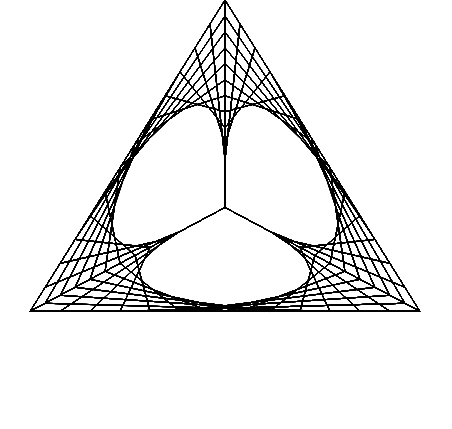
| Category | Series 0 |
|---|---|
| 6.1257422745431e-17 | 1 |
| 0.7327907262791404 | -0.269 |
| 0.26646935501059654 | -0.154 |
| 0.4663213712685439 | -0.269 |
| 0.19985201625794752 | -0.5 |
| -0.6661733875264911 | -0.385 |
| -0.06661733875264912 | -0.038 |
| -0.7994080650317894 | -0.462 |
| -0.19985201625794724 | 0.654 |
| 2.3560547209781152e-17 | 0.385 |
| 2.8272656651737385e-17 | 0.462 |
| 0.2664693550105966 | 0.538 |
| 0.7327907262791404 | -0.423 |
| 0.0 | 0 |
| 0.7327907262791404 | -0.423 |
| -0.3330866937632455 | -0.5 |
| -0.3997040325158947 | -0.231 |
| -0.33308669376324557 | -0.192 |
| -0.6661733875264911 | -0.154 |
| 5.654531330347477e-17 | 0.923 |
| 4.7121094419562276e-18 | 0.077 |
| 4.712109441956231e-17 | 0.769 |
| 0.5329387100211931 | 0.077 |
| 0.4663213712685439 | -0.269 |
| 0.26646935501059654 | -0.154 |
| 0.5995560487738422 | -0.5 |
| -0.8660254037844385 | -0.5 |
| -0.13323467750529824 | -0.077 |
| -0.599556048773842 | -0.346 |
| -0.39970403251589465 | 0.308 |
| 3.769687553564985e-17 | 0.615 |
| 1.4136328325868693e-17 | 0.231 |
| 0.06661733875264919 | 0.885 |
| 0.7994080650317896 | -0.385 |
| 0.19985201625794735 | -0.115 |
| 0.5329387100211931 | -0.308 |
| 0.06661733875264919 | -0.5 |
| -0.599556048773842 | -0.346 |
| -0.13323467750529824 | -0.077 |
| -0.8660254037844385 | -0.5 |
| -0.1332346775052982 | 0.769 |
| 1.8848437767824926e-17 | 0.308 |
| 3.2984766093693615e-17 | 0.538 |
| 0.33308669376324573 | 0.423 |
| 0.6661733875264912 | -0.385 |
| 0.06661733875264914 | -0.038 |
| 0.7994080650317896 | -0.462 |
| -0.4663213712685438 | -0.5 |
| -0.33308669376324557 | -0.192 |
| -0.3997040325158947 | -0.231 |
| -0.599556048773842 | -0.038 |
| 5.183320386151854e-17 | 0.846 |
| 0.0 | 0 |
| 5.183320386151854e-17 | 0.846 |
| 0.5995560487738422 | -0.038 |
| 0.3997040325158948 | -0.231 |
| 0.3330866937632457 | -0.192 |
| 0.4663213712685439 | -0.5 |
| -0.7994080650317894 | -0.462 |
| -0.06661733875264907 | -0.038 |
| -0.6661733875264911 | -0.385 |
| -0.3330866937632455 | 0.423 |
| 3.2984766093693615e-17 | 0.538 |
| 1.8848437767824926e-17 | 0.308 |
| 0.13323467750529833 | 0.769 |
| 0.8660254037844387 | -0.5 |
| 0.13323467750529827 | -0.077 |
| 0.5995560487738422 | -0.346 |
| -0.06661733875264897 | -0.5 |
| -0.532938710021193 | -0.308 |
| -0.19985201625794735 | -0.115 |
| -0.7994080650317894 | -0.385 |
| -0.06661733875264901 | 0.885 |
| 1.413632832586869e-17 | 0.231 |
| 3.769687553564985e-17 | 0.615 |
| 0.39970403251589487 | 0.308 |
| 0.5995560487738422 | -0.346 |
| 0.13323467750529827 | -0.077 |
| 0.8660254037844387 | -0.5 |
| -0.5995560487738419 | -0.5 |
| -0.2664693550105965 | -0.154 |
| -0.4663213712685438 | -0.269 |
| -0.532938710021193 | 0.077 |
| 4.7121094419562305e-17 | 0.769 |
| 4.7121094419562314e-18 | 0.077 |
| 5.654531330347477e-17 | 0.923 |
| 0.6661733875264914 | -0.154 |
| 0.3330866937632456 | -0.192 |
| 0.3997040325158948 | -0.231 |
| 0.3330866937632457 | -0.5 |
| -0.7327907262791402 | -0.423 |
| 0.0 | 0 |
| -0.7327907262791402 | -0.423 |
| -0.26646935501059643 | 0.538 |
| 2.8272656651737385e-17 | 0.462 |
| 2.3560547209781155e-17 | 0.385 |
| 0.19985201625794746 | 0.654 |
| 0.7994080650317896 | -0.462 |
| 0.06661733875264908 | -0.038 |
| 0.6661733875264914 | -0.385 |
| -0.19985201625794735 | -0.5 |
| -0.4663213712685438 | -0.269 |
| -0.2664693550105965 | -0.154 |
| -0.7327907262791402 | -0.269 |
| 6.1257422745431e-17 | 1 |
| 9.424218883912463e-18 | 0.154 |
| 4.2408984977606075e-17 | 0.692 |
| 0.46632137126854395 | 0.192 |
| 0.5329387100211931 | -0.308 |
| 0.1998520162579474 | -0.115 |
| 0.7327907262791405 | -0.5 |
| -0.7327907262791403 | -0.5 |
| -0.1998520162579473 | -0.115 |
| -0.532938710021193 | -0.308 |
| -0.4663213712685437 | 0.192 |
| 4.2408984977606075e-17 | 0.692 |
| 9.424218883912463e-18 | 0.154 |
| 6.1257422745431e-17 | 1 |
| 0.7327907262791404 | -0.269 |
| 0.26646935501059654 | -0.154 |
| 0.4663213712685439 | -0.269 |
| 0.19985201625794752 | -0.5 |
| -0.6661733875264911 | -0.385 |
| -0.06661733875264912 | -0.038 |
| -0.7994080650317894 | -0.462 |
| -0.19985201625794724 | 0.654 |
| 2.3560547209781152e-17 | 0.385 |
| 2.8272656651737385e-17 | 0.462 |
| 0.2664693550105966 | 0.538 |
| 0.7327907262791404 | -0.423 |
| 0.0 | 0 |
| 0.7327907262791404 | -0.423 |
| -0.3330866937632455 | -0.5 |
| -0.3997040325158947 | -0.231 |
| -0.33308669376324557 | -0.192 |
| -0.6661733875264911 | -0.154 |
| 5.654531330347477e-17 | 0.923 |
| 4.7121094419562276e-18 | 0.077 |
| 4.712109441956231e-17 | 0.769 |
| 0.5329387100211931 | 0.077 |
| 0.4663213712685439 | -0.269 |
| 0.26646935501059654 | -0.154 |
| 0.5995560487738422 | -0.5 |
| -0.8660254037844385 | -0.5 |
| -0.13323467750529824 | -0.077 |
| -0.599556048773842 | -0.346 |
| -0.39970403251589465 | 0.308 |
| 3.769687553564985e-17 | 0.615 |
| 1.4136328325868693e-17 | 0.231 |
| 0.06661733875264919 | 0.885 |
| 0.7994080650317896 | -0.385 |
| 0.19985201625794735 | -0.115 |
| 0.5329387100211931 | -0.308 |
| 0.06661733875264919 | -0.5 |
| -0.599556048773842 | -0.346 |
| -0.13323467750529824 | -0.077 |
| -0.8660254037844385 | -0.5 |
| -0.1332346775052982 | 0.769 |
| 1.8848437767824926e-17 | 0.308 |
| 3.2984766093693615e-17 | 0.538 |
| 0.33308669376324573 | 0.423 |
| 0.6661733875264912 | -0.385 |
| 0.06661733875264914 | -0.038 |
| 0.7994080650317896 | -0.462 |
| -0.4663213712685438 | -0.5 |
| -0.33308669376324557 | -0.192 |
| -0.3997040325158947 | -0.231 |
| -0.599556048773842 | -0.038 |
| 5.183320386151854e-17 | 0.846 |
| 0.0 | 0 |
| 5.183320386151854e-17 | 0.846 |
| 0.5995560487738422 | -0.038 |
| 0.3997040325158948 | -0.231 |
| 0.3330866937632457 | -0.192 |
| 0.4663213712685439 | -0.5 |
| -0.7994080650317894 | -0.462 |
| -0.06661733875264907 | -0.038 |
| -0.6661733875264911 | -0.385 |
| -0.3330866937632455 | 0.423 |
| 3.2984766093693615e-17 | 0.538 |
| 1.8848437767824926e-17 | 0.308 |
| 0.13323467750529833 | 0.769 |
| 0.8660254037844387 | -0.5 |
| 0.13323467750529827 | -0.077 |
| 0.5995560487738422 | -0.346 |
| -0.06661733875264897 | -0.5 |
| -0.532938710021193 | -0.308 |
| -0.19985201625794735 | -0.115 |
| -0.7994080650317894 | -0.385 |
| -0.06661733875264901 | 0.885 |
| 1.413632832586869e-17 | 0.231 |
| 3.769687553564985e-17 | 0.615 |
| 0.39970403251589487 | 0.308 |
| 0.5995560487738422 | -0.346 |
| 0.13323467750529827 | -0.077 |
| 0.8660254037844387 | -0.5 |
| -0.5995560487738419 | -0.5 |
| -0.2664693550105965 | -0.154 |
| -0.4663213712685438 | -0.269 |
| -0.532938710021193 | 0.077 |
| 4.7121094419562305e-17 | 0.769 |
| 4.7121094419562314e-18 | 0.077 |
| 5.654531330347477e-17 | 0.923 |
| 0.6661733875264914 | -0.154 |
| 0.3330866937632456 | -0.192 |
| 0.3997040325158948 | -0.231 |
| 0.3330866937632457 | -0.5 |
| -0.7327907262791402 | -0.423 |
| 0.0 | 0 |
| -0.7327907262791402 | -0.423 |
| -0.26646935501059643 | 0.538 |
| 2.8272656651737385e-17 | 0.462 |
| 2.3560547209781155e-17 | 0.385 |
| 0.19985201625794746 | 0.654 |
| 0.7994080650317896 | -0.462 |
| 0.06661733875264908 | -0.038 |
| 0.6661733875264914 | -0.385 |
| -0.19985201625794735 | -0.5 |
| -0.4663213712685438 | -0.269 |
| -0.2664693550105965 | -0.154 |
| -0.7327907262791402 | -0.269 |
| 6.1257422745431e-17 | 1 |
| 9.424218883912463e-18 | 0.154 |
| 4.2408984977606075e-17 | 0.692 |
| 0.46632137126854395 | 0.192 |
| 0.5329387100211931 | -0.308 |
| 0.1998520162579474 | -0.115 |
| 0.7327907262791405 | -0.5 |
| -0.7327907262791403 | -0.5 |
| -0.1998520162579473 | -0.115 |
| -0.532938710021193 | -0.308 |
| -0.4663213712685437 | 0.192 |
| 4.2408984977606075e-17 | 0.692 |
| 9.424218883912463e-18 | 0.154 |
| 6.1257422745431e-17 | 1 |
| 0.7327907262791404 | -0.269 |
| 0.26646935501059654 | -0.154 |
| 0.4663213712685439 | -0.269 |
| 0.19985201625794752 | -0.5 |
| -0.6661733875264911 | -0.385 |
| -0.06661733875264912 | -0.038 |
| -0.7994080650317894 | -0.462 |
| -0.19985201625794724 | 0.654 |
| 2.3560547209781152e-17 | 0.385 |
| 2.8272656651737385e-17 | 0.462 |
| 0.2664693550105966 | 0.538 |
| 0.7327907262791404 | -0.423 |
| 0.0 | 0 |
| 0.7327907262791404 | -0.423 |
| -0.3330866937632455 | -0.5 |
| -0.3997040325158947 | -0.231 |
| -0.33308669376324557 | -0.192 |
| -0.6661733875264911 | -0.154 |
| 5.654531330347477e-17 | 0.923 |
| 4.7121094419562276e-18 | 0.077 |
| 4.712109441956231e-17 | 0.769 |
| 0.5329387100211931 | 0.077 |
| 0.4663213712685439 | -0.269 |
| 0.26646935501059654 | -0.154 |
| 0.5995560487738422 | -0.5 |
| -0.8660254037844385 | -0.5 |
| -0.13323467750529824 | -0.077 |
| -0.599556048773842 | -0.346 |
| -0.39970403251589465 | 0.308 |
| 3.769687553564985e-17 | 0.615 |
| 1.4136328325868693e-17 | 0.231 |
| 0.06661733875264919 | 0.885 |
| 0.7994080650317896 | -0.385 |
| 0.19985201625794735 | -0.115 |
| 0.5329387100211931 | -0.308 |
| 0.06661733875264919 | -0.5 |
| -0.599556048773842 | -0.346 |
| -0.13323467750529824 | -0.077 |
| -0.8660254037844385 | -0.5 |
| -0.1332346775052982 | 0.769 |
| 1.8848437767824926e-17 | 0.308 |
| 3.2984766093693615e-17 | 0.538 |
| 0.33308669376324573 | 0.423 |
| 0.6661733875264912 | -0.385 |
| 0.06661733875264914 | -0.038 |
| 0.7994080650317896 | -0.462 |
| -0.4663213712685438 | -0.5 |
| -0.33308669376324557 | -0.192 |
| -0.3997040325158947 | -0.231 |
| -0.599556048773842 | -0.038 |
| 5.183320386151854e-17 | 0.846 |
| 0.0 | 0 |
| 5.183320386151854e-17 | 0.846 |
| 0.5995560487738422 | -0.038 |
| 0.3997040325158948 | -0.231 |
| 0.3330866937632457 | -0.192 |
| 0.4663213712685439 | -0.5 |
| -0.7994080650317894 | -0.462 |
| -0.06661733875264907 | -0.038 |
| -0.6661733875264911 | -0.385 |
| -0.3330866937632455 | 0.423 |
| 3.2984766093693615e-17 | 0.538 |
| 1.8848437767824926e-17 | 0.308 |
| 0.13323467750529833 | 0.769 |
| 0.8660254037844387 | -0.5 |
| 0.13323467750529827 | -0.077 |
| 0.5995560487738422 | -0.346 |
| -0.06661733875264897 | -0.5 |
| -0.532938710021193 | -0.308 |
| -0.19985201625794735 | -0.115 |
| -0.7994080650317894 | -0.385 |
| -0.06661733875264901 | 0.885 |
| 1.413632832586869e-17 | 0.231 |
| 3.769687553564985e-17 | 0.615 |
| 0.39970403251589487 | 0.308 |
| 0.5995560487738422 | -0.346 |
| 0.13323467750529827 | -0.077 |
| 0.8660254037844387 | -0.5 |
| -0.5995560487738419 | -0.5 |
| -0.2664693550105965 | -0.154 |
| -0.4663213712685438 | -0.269 |
| -0.532938710021193 | 0.077 |
| 4.7121094419562305e-17 | 0.769 |
| 4.7121094419562314e-18 | 0.077 |
| 5.654531330347477e-17 | 0.923 |
| 0.6661733875264914 | -0.154 |
| 0.3330866937632456 | -0.192 |
| 0.3997040325158948 | -0.231 |
| 0.3330866937632457 | -0.5 |
| -0.7327907262791402 | -0.423 |
| 0.0 | 0 |
| -0.7327907262791402 | -0.423 |
| -0.26646935501059643 | 0.538 |
| 2.8272656651737385e-17 | 0.462 |
| 2.3560547209781155e-17 | 0.385 |
| 0.19985201625794746 | 0.654 |
| 0.7994080650317896 | -0.462 |
| 0.06661733875264908 | -0.038 |
| 0.6661733875264914 | -0.385 |
| -0.19985201625794735 | -0.5 |
| -0.4663213712685438 | -0.269 |
| -0.2664693550105965 | -0.154 |
| -0.7327907262791402 | -0.269 |
| 6.1257422745431e-17 | 1 |
| 9.424218883912463e-18 | 0.154 |
| 4.2408984977606075e-17 | 0.692 |
| 0.46632137126854395 | 0.192 |
| 0.5329387100211931 | -0.308 |
| 0.1998520162579474 | -0.115 |
| 0.7327907262791405 | -0.5 |
| -0.7327907262791403 | -0.5 |
| -0.1998520162579473 | -0.115 |
| -0.532938710021193 | -0.308 |
| -0.4663213712685437 | 0.192 |
| 4.2408984977606075e-17 | 0.692 |
| 9.424218883912463e-18 | 0.154 |
| 6.1257422745431e-17 | 1 |
| 0.7327907262791404 | -0.269 |
| 0.26646935501059654 | -0.154 |
| 0.4663213712685439 | -0.269 |
| 0.19985201625794752 | -0.5 |
| -0.6661733875264911 | -0.385 |
| -0.06661733875264912 | -0.038 |
| -0.7994080650317894 | -0.462 |
| -0.19985201625794724 | 0.654 |
| 2.3560547209781152e-17 | 0.385 |
| 2.8272656651737385e-17 | 0.462 |
| 0.2664693550105966 | 0.538 |
| 0.7327907262791404 | -0.423 |
| 0.0 | 0 |
| 0.7327907262791404 | -0.423 |
| -0.3330866937632455 | -0.5 |
| -0.3997040325158947 | -0.231 |
| -0.33308669376324557 | -0.192 |
| -0.6661733875264911 | -0.154 |
| 5.654531330347477e-17 | 0.923 |
| 4.7121094419562276e-18 | 0.077 |
| 4.712109441956231e-17 | 0.769 |
| 0.5329387100211931 | 0.077 |
| 0.4663213712685439 | -0.269 |
| 0.26646935501059654 | -0.154 |
| 0.5995560487738422 | -0.5 |
| -0.8660254037844385 | -0.5 |
| -0.13323467750529824 | -0.077 |
| -0.599556048773842 | -0.346 |
| -0.39970403251589465 | 0.308 |
| 3.769687553564985e-17 | 0.615 |
| 1.4136328325868693e-17 | 0.231 |
| 0.06661733875264919 | 0.885 |
| 0.7994080650317896 | -0.385 |
| 0.19985201625794735 | -0.115 |
| 0.5329387100211931 | -0.308 |
| 0.06661733875264919 | -0.5 |
| -0.599556048773842 | -0.346 |
| -0.13323467750529824 | -0.077 |
| -0.8660254037844385 | -0.5 |
| -0.1332346775052982 | 0.769 |
| 1.8848437767824926e-17 | 0.308 |
| 3.2984766093693615e-17 | 0.538 |
| 0.33308669376324573 | 0.423 |
| 0.6661733875264912 | -0.385 |
| 0.06661733875264914 | -0.038 |
| 0.7994080650317896 | -0.462 |
| -0.4663213712685438 | -0.5 |
| -0.33308669376324557 | -0.192 |
| -0.3997040325158947 | -0.231 |
| -0.599556048773842 | -0.038 |
| 5.183320386151854e-17 | 0.846 |
| 0.0 | 0 |
| 5.183320386151854e-17 | 0.846 |
| 0.5995560487738422 | -0.038 |
| 0.3997040325158948 | -0.231 |
| 0.3330866937632457 | -0.192 |
| 0.4663213712685439 | -0.5 |
| -0.7994080650317894 | -0.462 |
| -0.06661733875264907 | -0.038 |
| -0.6661733875264911 | -0.385 |
| -0.3330866937632455 | 0.423 |
| 3.2984766093693615e-17 | 0.538 |
| 1.8848437767824926e-17 | 0.308 |
| 0.13323467750529833 | 0.769 |
| 0.8660254037844387 | -0.5 |
| 0.13323467750529827 | -0.077 |
| 0.5995560487738422 | -0.346 |
| -0.06661733875264897 | -0.5 |
| -0.532938710021193 | -0.308 |
| -0.19985201625794735 | -0.115 |
| -0.7994080650317894 | -0.385 |
| -0.06661733875264901 | 0.885 |
| 1.413632832586869e-17 | 0.231 |
| 3.769687553564985e-17 | 0.615 |
| 0.39970403251589487 | 0.308 |
| 0.5995560487738422 | -0.346 |
| 0.13323467750529827 | -0.077 |
| 0.8660254037844387 | -0.5 |
| -0.5995560487738419 | -0.5 |
| -0.2664693550105965 | -0.154 |
| -0.4663213712685438 | -0.269 |
| -0.532938710021193 | 0.077 |
| 4.7121094419562305e-17 | 0.769 |
| 4.7121094419562314e-18 | 0.077 |
| 5.654531330347477e-17 | 0.923 |
| 0.6661733875264914 | -0.154 |
| 0.3330866937632456 | -0.192 |
| 0.3997040325158948 | -0.231 |
| 0.3330866937632457 | -0.5 |
| -0.7327907262791402 | -0.423 |
| 0.0 | 0 |
| -0.7327907262791402 | -0.423 |
| -0.26646935501059643 | 0.538 |
| 2.8272656651737385e-17 | 0.462 |
| 2.3560547209781155e-17 | 0.385 |
| 0.19985201625794746 | 0.654 |
| 0.7994080650317896 | -0.462 |
| 0.06661733875264908 | -0.038 |
| 0.6661733875264914 | -0.385 |
| -0.19985201625794735 | -0.5 |
| -0.4663213712685438 | -0.269 |
| -0.2664693550105965 | -0.154 |
| -0.7327907262791402 | -0.269 |
| 6.1257422745431e-17 | 1 |
| 9.424218883912463e-18 | 0.154 |
| 4.2408984977606075e-17 | 0.692 |
| 0.46632137126854395 | 0.192 |
| 0.5329387100211931 | -0.308 |
| 0.1998520162579474 | -0.115 |
| 0.7327907262791405 | -0.5 |
| -0.7327907262791403 | -0.5 |
| -0.1998520162579473 | -0.115 |
| -0.532938710021193 | -0.308 |
| -0.4663213712685437 | 0.192 |
| 4.2408984977606075e-17 | 0.692 |
| 9.424218883912463e-18 | 0.154 |
| 6.1257422745431e-17 | 1 |
| 0.7327907262791404 | -0.269 |
| 0.26646935501059654 | -0.154 |
| 0.4663213712685439 | -0.269 |
| 0.19985201625794752 | -0.5 |
| -0.6661733875264911 | -0.385 |
| -0.06661733875264912 | -0.038 |
| -0.7994080650317894 | -0.462 |
| -0.19985201625794724 | 0.654 |
| 2.3560547209781152e-17 | 0.385 |
| 2.8272656651737385e-17 | 0.462 |
| 0.2664693550105966 | 0.538 |
| 0.7327907262791404 | -0.423 |
| 0.0 | 0 |
| 0.7327907262791404 | -0.423 |
| -0.3330866937632455 | -0.5 |
| -0.3997040325158947 | -0.231 |
| -0.33308669376324557 | -0.192 |
| -0.6661733875264911 | -0.154 |
| 5.654531330347477e-17 | 0.923 |
| 4.7121094419562276e-18 | 0.077 |
| 4.712109441956231e-17 | 0.769 |
| 0.5329387100211931 | 0.077 |
| 0.4663213712685439 | -0.269 |
| 0.26646935501059654 | -0.154 |
| 0.5995560487738422 | -0.5 |
| -0.8660254037844385 | -0.5 |
| -0.13323467750529824 | -0.077 |
| -0.599556048773842 | -0.346 |
| -0.39970403251589465 | 0.308 |
| 3.769687553564985e-17 | 0.615 |
| 1.4136328325868693e-17 | 0.231 |
| 0.06661733875264919 | 0.885 |
| 0.7994080650317896 | -0.385 |
| 0.19985201625794735 | -0.115 |
| 0.5329387100211931 | -0.308 |
| 0.06661733875264919 | -0.5 |
| -0.599556048773842 | -0.346 |
| -0.13323467750529824 | -0.077 |
| -0.8660254037844385 | -0.5 |
| -0.1332346775052982 | 0.769 |
| 1.8848437767824926e-17 | 0.308 |
| 3.2984766093693615e-17 | 0.538 |
| 0.33308669376324573 | 0.423 |
| 0.6661733875264912 | -0.385 |
| 0.06661733875264914 | -0.038 |
| 0.7994080650317896 | -0.462 |
| -0.4663213712685438 | -0.5 |
| -0.33308669376324557 | -0.192 |
| -0.3997040325158947 | -0.231 |
| -0.599556048773842 | -0.038 |
| 5.183320386151854e-17 | 0.846 |
| 0.0 | 0 |
| 5.183320386151854e-17 | 0.846 |
| 0.5995560487738422 | -0.038 |
| 0.3997040325158948 | -0.231 |
| 0.3330866937632457 | -0.192 |
| 0.4663213712685439 | -0.5 |
| -0.7994080650317894 | -0.462 |
| -0.06661733875264907 | -0.038 |
| -0.6661733875264911 | -0.385 |
| -0.3330866937632455 | 0.423 |
| 3.2984766093693615e-17 | 0.538 |
| 1.8848437767824926e-17 | 0.308 |
| 0.13323467750529833 | 0.769 |
| 0.8660254037844387 | -0.5 |
| 0.13323467750529827 | -0.077 |
| 0.5995560487738422 | -0.346 |
| -0.06661733875264897 | -0.5 |
| -0.532938710021193 | -0.308 |
| -0.19985201625794735 | -0.115 |
| -0.7994080650317894 | -0.385 |
| -0.06661733875264901 | 0.885 |
| 1.413632832586869e-17 | 0.231 |
| 3.769687553564985e-17 | 0.615 |
| 0.39970403251589487 | 0.308 |
| 0.5995560487738422 | -0.346 |
| 0.13323467750529827 | -0.077 |
| 0.8660254037844387 | -0.5 |
| -0.5995560487738419 | -0.5 |
| -0.2664693550105965 | -0.154 |
| -0.4663213712685438 | -0.269 |
| -0.532938710021193 | 0.077 |
| 4.7121094419562305e-17 | 0.769 |
| 4.7121094419562314e-18 | 0.077 |
| 5.654531330347477e-17 | 0.923 |
| 0.6661733875264914 | -0.154 |
| 0.3330866937632456 | -0.192 |
| 0.3997040325158948 | -0.231 |
| 0.3330866937632457 | -0.5 |
| -0.7327907262791402 | -0.423 |
| 0.0 | 0 |
| -0.7327907262791402 | -0.423 |
| -0.26646935501059643 | 0.538 |
| 2.8272656651737385e-17 | 0.462 |
| 2.3560547209781155e-17 | 0.385 |
| 0.19985201625794746 | 0.654 |
| 0.7994080650317896 | -0.462 |
| 0.06661733875264908 | -0.038 |
| 0.6661733875264914 | -0.385 |
| -0.19985201625794735 | -0.5 |
| -0.4663213712685438 | -0.269 |
| -0.2664693550105965 | -0.154 |
| -0.7327907262791402 | -0.269 |
| 6.1257422745431e-17 | 1 |
| 9.424218883912463e-18 | 0.154 |
| 4.2408984977606075e-17 | 0.692 |
| 0.46632137126854395 | 0.192 |
| 0.5329387100211931 | -0.308 |
| 0.1998520162579474 | -0.115 |
| 0.7327907262791405 | -0.5 |
| -0.7327907262791403 | -0.5 |
| -0.1998520162579473 | -0.115 |
| -0.532938710021193 | -0.308 |
| -0.4663213712685437 | 0.192 |
| 4.2408984977606075e-17 | 0.692 |
| 9.424218883912463e-18 | 0.154 |
| 6.1257422745431e-17 | 1 |
| 0.7327907262791404 | -0.269 |
| 0.26646935501059654 | -0.154 |
| 0.4663213712685439 | -0.269 |
| 0.19985201625794752 | -0.5 |
| -0.6661733875264911 | -0.385 |
| -0.06661733875264912 | -0.038 |
| -0.7994080650317894 | -0.462 |
| -0.19985201625794724 | 0.654 |
| 2.3560547209781152e-17 | 0.385 |
| 2.8272656651737385e-17 | 0.462 |
| 0.2664693550105966 | 0.538 |
| 0.7327907262791404 | -0.423 |
| 0.0 | 0 |
| 0.7327907262791404 | -0.423 |
| -0.3330866937632455 | -0.5 |
| -0.3997040325158947 | -0.231 |
| -0.33308669376324557 | -0.192 |
| -0.6661733875264911 | -0.154 |
| 5.654531330347477e-17 | 0.923 |
| 4.7121094419562276e-18 | 0.077 |
| 4.712109441956231e-17 | 0.769 |
| 0.5329387100211931 | 0.077 |
| 0.4663213712685439 | -0.269 |
| 0.26646935501059654 | -0.154 |
| 0.5995560487738422 | -0.5 |
| -0.8660254037844385 | -0.5 |
| -0.13323467750529824 | -0.077 |
| -0.599556048773842 | -0.346 |
| -0.39970403251589465 | 0.308 |
| 3.769687553564985e-17 | 0.615 |
| 1.4136328325868693e-17 | 0.231 |
| 0.06661733875264919 | 0.885 |
| 0.7994080650317896 | -0.385 |
| 0.19985201625794735 | -0.115 |
| 0.5329387100211931 | -0.308 |
| 0.06661733875264919 | -0.5 |
| -0.599556048773842 | -0.346 |
| -0.13323467750529824 | -0.077 |
| -0.8660254037844385 | -0.5 |
| -0.1332346775052982 | 0.769 |
| 1.8848437767824926e-17 | 0.308 |
| 3.2984766093693615e-17 | 0.538 |
| 0.33308669376324573 | 0.423 |
| 0.6661733875264912 | -0.385 |
| 0.06661733875264914 | -0.038 |
| 0.7994080650317896 | -0.462 |
| -0.4663213712685438 | -0.5 |
| -0.33308669376324557 | -0.192 |
| -0.3997040325158947 | -0.231 |
| -0.599556048773842 | -0.038 |
| 5.183320386151854e-17 | 0.846 |
| 0.0 | 0 |
| 5.183320386151854e-17 | 0.846 |
| 0.5995560487738422 | -0.038 |
| 0.3997040325158948 | -0.231 |
| 0.3330866937632457 | -0.192 |
| 0.4663213712685439 | -0.5 |
| -0.7994080650317894 | -0.462 |
| -0.06661733875264907 | -0.038 |
| -0.6661733875264911 | -0.385 |
| -0.3330866937632455 | 0.423 |
| 3.2984766093693615e-17 | 0.538 |
| 1.8848437767824926e-17 | 0.308 |
| 0.13323467750529833 | 0.769 |
| 0.8660254037844387 | -0.5 |
| 0.13323467750529827 | -0.077 |
| 0.5995560487738422 | -0.346 |
| -0.06661733875264897 | -0.5 |
| -0.532938710021193 | -0.308 |
| -0.19985201625794735 | -0.115 |
| -0.7994080650317894 | -0.385 |
| -0.06661733875264901 | 0.885 |
| 1.413632832586869e-17 | 0.231 |
| 3.769687553564985e-17 | 0.615 |
| 0.39970403251589487 | 0.308 |
| 0.5995560487738422 | -0.346 |
| 0.13323467750529827 | -0.077 |
| 0.8660254037844387 | -0.5 |
| -0.5995560487738419 | -0.5 |
| -0.2664693550105965 | -0.154 |
| -0.4663213712685438 | -0.269 |
| -0.532938710021193 | 0.077 |
| 4.7121094419562305e-17 | 0.769 |
| 4.7121094419562314e-18 | 0.077 |
| 5.654531330347477e-17 | 0.923 |
| 0.6661733875264914 | -0.154 |
| 0.3330866937632456 | -0.192 |
| 0.3997040325158948 | -0.231 |
| 0.3330866937632457 | -0.5 |
| -0.7327907262791402 | -0.423 |
| 0.0 | 0 |
| -0.7327907262791402 | -0.423 |
| -0.26646935501059643 | 0.538 |
| 2.8272656651737385e-17 | 0.462 |
| 2.3560547209781155e-17 | 0.385 |
| 0.19985201625794746 | 0.654 |
| 0.7994080650317896 | -0.462 |
| 0.06661733875264908 | -0.038 |
| 0.6661733875264914 | -0.385 |
| -0.19985201625794735 | -0.5 |
| -0.4663213712685438 | -0.269 |
| -0.2664693550105965 | -0.154 |
| -0.7327907262791402 | -0.269 |
| 6.1257422745431e-17 | 1 |
| 9.424218883912463e-18 | 0.154 |
| 4.2408984977606075e-17 | 0.692 |
| 0.46632137126854395 | 0.192 |
| 0.5329387100211931 | -0.308 |
| 0.1998520162579474 | -0.115 |
| 0.7327907262791405 | -0.5 |
| -0.7327907262791403 | -0.5 |
| -0.1998520162579473 | -0.115 |
| -0.532938710021193 | -0.308 |
| -0.4663213712685437 | 0.192 |
| 4.2408984977606075e-17 | 0.692 |
| 9.424218883912463e-18 | 0.154 |
| 6.1257422745431e-17 | 1 |
| 0.7327907262791404 | -0.269 |
| 0.26646935501059654 | -0.154 |
| 0.4663213712685439 | -0.269 |
| 0.19985201625794752 | -0.5 |
| -0.6661733875264911 | -0.385 |
| -0.06661733875264912 | -0.038 |
| -0.7994080650317894 | -0.462 |
| -0.19985201625794724 | 0.654 |
| 2.3560547209781152e-17 | 0.385 |
| 2.8272656651737385e-17 | 0.462 |
| 0.2664693550105966 | 0.538 |
| 0.7327907262791404 | -0.423 |
| 0.0 | 0 |
| 0.7327907262791404 | -0.423 |
| -0.3330866937632455 | -0.5 |
| -0.3997040325158947 | -0.231 |
| -0.33308669376324557 | -0.192 |
| -0.6661733875264911 | -0.154 |
| 5.654531330347477e-17 | 0.923 |
| 4.7121094419562276e-18 | 0.077 |
| 4.712109441956231e-17 | 0.769 |
| 0.5329387100211931 | 0.077 |
| 0.4663213712685439 | -0.269 |
| 0.26646935501059654 | -0.154 |
| 0.5995560487738422 | -0.5 |
| -0.8660254037844385 | -0.5 |
| -0.13323467750529824 | -0.077 |
| -0.599556048773842 | -0.346 |
| -0.39970403251589465 | 0.308 |
| 3.769687553564985e-17 | 0.615 |
| 1.4136328325868693e-17 | 0.231 |
| 0.06661733875264919 | 0.885 |
| 0.7994080650317896 | -0.385 |
| 0.19985201625794735 | -0.115 |
| 0.5329387100211931 | -0.308 |
| 0.06661733875264919 | -0.5 |
| -0.599556048773842 | -0.346 |
| -0.13323467750529824 | -0.077 |
| -0.8660254037844385 | -0.5 |
| -0.1332346775052982 | 0.769 |
| 1.8848437767824926e-17 | 0.308 |
| 3.2984766093693615e-17 | 0.538 |
| 0.33308669376324573 | 0.423 |
| 0.6661733875264912 | -0.385 |
| 0.06661733875264914 | -0.038 |
| 0.7994080650317896 | -0.462 |
| -0.4663213712685438 | -0.5 |
| -0.33308669376324557 | -0.192 |
| -0.3997040325158947 | -0.231 |
| -0.599556048773842 | -0.038 |
| 5.183320386151854e-17 | 0.846 |
| 0.0 | 0 |
| 5.183320386151854e-17 | 0.846 |
| 0.5995560487738422 | -0.038 |
| 0.3997040325158948 | -0.231 |
| 0.3330866937632457 | -0.192 |
| 0.4663213712685439 | -0.5 |
| -0.7994080650317894 | -0.462 |
| -0.06661733875264907 | -0.038 |
| -0.6661733875264911 | -0.385 |
| -0.3330866937632455 | 0.423 |
| 3.2984766093693615e-17 | 0.538 |
| 1.8848437767824926e-17 | 0.308 |
| 0.13323467750529833 | 0.769 |
| 0.8660254037844387 | -0.5 |
| 0.13323467750529827 | -0.077 |
| 0.5995560487738422 | -0.346 |
| -0.06661733875264897 | -0.5 |
| -0.532938710021193 | -0.308 |
| -0.19985201625794735 | -0.115 |
| -0.7994080650317894 | -0.385 |
| -0.06661733875264901 | 0.885 |
| 1.413632832586869e-17 | 0.231 |
| 3.769687553564985e-17 | 0.615 |
| 0.39970403251589487 | 0.308 |
| 0.5995560487738422 | -0.346 |
| 0.13323467750529827 | -0.077 |
| 0.8660254037844387 | -0.5 |
| -0.5995560487738419 | -0.5 |
| -0.2664693550105965 | -0.154 |
| -0.4663213712685438 | -0.269 |
| -0.532938710021193 | 0.077 |
| 4.7121094419562305e-17 | 0.769 |
| 4.7121094419562314e-18 | 0.077 |
| 5.654531330347477e-17 | 0.923 |
| 0.6661733875264914 | -0.154 |
| 0.3330866937632456 | -0.192 |
| 0.3997040325158948 | -0.231 |
| 0.3330866937632457 | -0.5 |
| -0.7327907262791402 | -0.423 |
| 0.0 | 0 |
| -0.7327907262791402 | -0.423 |
| -0.26646935501059643 | 0.538 |
| 2.8272656651737385e-17 | 0.462 |
| 2.3560547209781155e-17 | 0.385 |
| 0.19985201625794746 | 0.654 |
| 0.7994080650317896 | -0.462 |
| 0.06661733875264908 | -0.038 |
| 0.6661733875264914 | -0.385 |
| -0.19985201625794735 | -0.5 |
| -0.4663213712685438 | -0.269 |
| -0.2664693550105965 | -0.154 |
| -0.7327907262791402 | -0.269 |
| 6.1257422745431e-17 | 1 |
| 9.424218883912463e-18 | 0.154 |
| 4.2408984977606075e-17 | 0.692 |
| 0.46632137126854395 | 0.192 |
| 0.5329387100211931 | -0.308 |
| 0.1998520162579474 | -0.115 |
| 0.7327907262791405 | -0.5 |
| -0.7327907262791403 | -0.5 |
| -0.1998520162579473 | -0.115 |
| -0.532938710021193 | -0.308 |
| -0.4663213712685437 | 0.192 |
| 4.2408984977606075e-17 | 0.692 |
| 9.424218883912463e-18 | 0.154 |
| 6.1257422745431e-17 | 1 |
| 0.7327907262791404 | -0.269 |
| 0.26646935501059654 | -0.154 |
| 0.4663213712685439 | -0.269 |
| 0.19985201625794752 | -0.5 |
| -0.6661733875264911 | -0.385 |
| -0.06661733875264912 | -0.038 |
| -0.7994080650317894 | -0.462 |
| -0.19985201625794724 | 0.654 |
| 2.3560547209781152e-17 | 0.385 |
| 2.8272656651737385e-17 | 0.462 |
| 0.2664693550105966 | 0.538 |
| 0.7327907262791404 | -0.423 |
| 0.0 | 0 |
| 0.7327907262791404 | -0.423 |
| -0.3330866937632455 | -0.5 |
| -0.3997040325158947 | -0.231 |
| -0.33308669376324557 | -0.192 |
| -0.6661733875264911 | -0.154 |
| 5.654531330347477e-17 | 0.923 |
| 4.7121094419562276e-18 | 0.077 |
| 4.712109441956231e-17 | 0.769 |
| 0.5329387100211931 | 0.077 |
| 0.4663213712685439 | -0.269 |
| 0.26646935501059654 | -0.154 |
| 0.5995560487738422 | -0.5 |
| -0.8660254037844385 | -0.5 |
| -0.13323467750529824 | -0.077 |
| -0.599556048773842 | -0.346 |
| -0.39970403251589465 | 0.308 |
| 3.769687553564985e-17 | 0.615 |
| 1.4136328325868693e-17 | 0.231 |
| 0.06661733875264919 | 0.885 |
| 0.7994080650317896 | -0.385 |
| 0.19985201625794735 | -0.115 |
| 0.5329387100211931 | -0.308 |
| 0.06661733875264919 | -0.5 |
| -0.599556048773842 | -0.346 |
| -0.13323467750529824 | -0.077 |
| -0.8660254037844385 | -0.5 |
| -0.1332346775052982 | 0.769 |
| 1.8848437767824926e-17 | 0.308 |
| 3.2984766093693615e-17 | 0.538 |
| 0.33308669376324573 | 0.423 |
| 0.6661733875264912 | -0.385 |
| 0.06661733875264914 | -0.038 |
| 0.7994080650317896 | -0.462 |
| -0.4663213712685438 | -0.5 |
| -0.33308669376324557 | -0.192 |
| -0.3997040325158947 | -0.231 |
| -0.599556048773842 | -0.038 |
| 5.183320386151854e-17 | 0.846 |
| 0.0 | 0 |
| 5.183320386151854e-17 | 0.846 |
| 0.5995560487738422 | -0.038 |
| 0.3997040325158948 | -0.231 |
| 0.3330866937632457 | -0.192 |
| 0.4663213712685439 | -0.5 |
| -0.7994080650317894 | -0.462 |
| -0.06661733875264907 | -0.038 |
| -0.6661733875264911 | -0.385 |
| -0.3330866937632455 | 0.423 |
| 3.2984766093693615e-17 | 0.538 |
| 1.8848437767824926e-17 | 0.308 |
| 0.13323467750529833 | 0.769 |
| 0.8660254037844387 | -0.5 |
| 0.13323467750529827 | -0.077 |
| 0.5995560487738422 | -0.346 |
| -0.06661733875264897 | -0.5 |
| -0.532938710021193 | -0.308 |
| -0.19985201625794735 | -0.115 |
| -0.7994080650317894 | -0.385 |
| -0.06661733875264901 | 0.885 |
| 1.413632832586869e-17 | 0.231 |
| 3.769687553564985e-17 | 0.615 |
| 0.39970403251589487 | 0.308 |
| 0.5995560487738422 | -0.346 |
| 0.13323467750529827 | -0.077 |
| 0.8660254037844387 | -0.5 |
| -0.5995560487738419 | -0.5 |
| -0.2664693550105965 | -0.154 |
| -0.4663213712685438 | -0.269 |
| -0.532938710021193 | 0.077 |
| 4.7121094419562305e-17 | 0.769 |
| 4.7121094419562314e-18 | 0.077 |
| 5.654531330347477e-17 | 0.923 |
| 0.6661733875264914 | -0.154 |
| 0.3330866937632456 | -0.192 |
| 0.3997040325158948 | -0.231 |
| 0.3330866937632457 | -0.5 |
| -0.7327907262791402 | -0.423 |
| 0.0 | 0 |
| -0.7327907262791402 | -0.423 |
| -0.26646935501059643 | 0.538 |
| 2.8272656651737385e-17 | 0.462 |
| 2.3560547209781155e-17 | 0.385 |
| 0.19985201625794746 | 0.654 |
| 0.7994080650317896 | -0.462 |
| 0.06661733875264908 | -0.038 |
| 0.6661733875264914 | -0.385 |
| -0.19985201625794735 | -0.5 |
| -0.4663213712685438 | -0.269 |
| -0.2664693550105965 | -0.154 |
| -0.7327907262791402 | -0.269 |
| 6.1257422745431e-17 | 1 |
| 9.424218883912463e-18 | 0.154 |
| 4.2408984977606075e-17 | 0.692 |
| 0.46632137126854395 | 0.192 |
| 0.5329387100211931 | -0.308 |
| 0.1998520162579474 | -0.115 |
| 0.7327907262791405 | -0.5 |
| -0.7327907262791403 | -0.5 |
| -0.1998520162579473 | -0.115 |
| -0.532938710021193 | -0.308 |
| -0.4663213712685437 | 0.192 |
| 4.2408984977606075e-17 | 0.692 |
| 9.424218883912463e-18 | 0.154 |
| 6.1257422745431e-17 | 1 |
| 0.7327907262791404 | -0.269 |
| 0.26646935501059654 | -0.154 |
| 0.4663213712685439 | -0.269 |
| 0.19985201625794752 | -0.5 |
| -0.6661733875264911 | -0.385 |
| -0.06661733875264912 | -0.038 |
| -0.7994080650317894 | -0.462 |
| -0.19985201625794724 | 0.654 |
| 2.3560547209781152e-17 | 0.385 |
| 2.8272656651737385e-17 | 0.462 |
| 0.2664693550105966 | 0.538 |
| 0.7327907262791404 | -0.423 |
| 0.0 | 0 |
| 0.7327907262791404 | -0.423 |
| -0.3330866937632455 | -0.5 |
| -0.3997040325158947 | -0.231 |
| -0.33308669376324557 | -0.192 |
| -0.6661733875264911 | -0.154 |
| 5.654531330347477e-17 | 0.923 |
| 4.7121094419562276e-18 | 0.077 |
| 4.712109441956231e-17 | 0.769 |
| 0.5329387100211931 | 0.077 |
| 0.4663213712685439 | -0.269 |
| 0.26646935501059654 | -0.154 |
| 0.5995560487738422 | -0.5 |
| -0.8660254037844385 | -0.5 |
| -0.13323467750529824 | -0.077 |
| -0.599556048773842 | -0.346 |
| -0.39970403251589465 | 0.308 |
| 3.769687553564985e-17 | 0.615 |
| 1.4136328325868693e-17 | 0.231 |
| 0.06661733875264919 | 0.885 |
| 0.7994080650317896 | -0.385 |
| 0.19985201625794735 | -0.115 |
| 0.5329387100211931 | -0.308 |
| 0.06661733875264919 | -0.5 |
| -0.599556048773842 | -0.346 |
| -0.13323467750529824 | -0.077 |
| -0.8660254037844385 | -0.5 |
| -0.1332346775052982 | 0.769 |
| 1.8848437767824926e-17 | 0.308 |
| 3.2984766093693615e-17 | 0.538 |
| 0.33308669376324573 | 0.423 |
| 0.6661733875264912 | -0.385 |
| 0.06661733875264914 | -0.038 |
| 0.7994080650317896 | -0.462 |
| -0.4663213712685438 | -0.5 |
| -0.33308669376324557 | -0.192 |
| -0.3997040325158947 | -0.231 |
| -0.599556048773842 | -0.038 |
| 5.183320386151854e-17 | 0.846 |
| 0.0 | 0 |
| 5.183320386151854e-17 | 0.846 |
| 0.5995560487738422 | -0.038 |
| 0.3997040325158948 | -0.231 |
| 0.3330866937632457 | -0.192 |
| 0.4663213712685439 | -0.5 |
| -0.7994080650317894 | -0.462 |
| -0.06661733875264907 | -0.038 |
| -0.6661733875264911 | -0.385 |
| -0.3330866937632455 | 0.423 |
| 3.2984766093693615e-17 | 0.538 |
| 1.8848437767824926e-17 | 0.308 |
| 0.13323467750529833 | 0.769 |
| 0.8660254037844387 | -0.5 |
| 0.13323467750529827 | -0.077 |
| 0.5995560487738422 | -0.346 |
| -0.06661733875264897 | -0.5 |
| -0.532938710021193 | -0.308 |
| -0.19985201625794735 | -0.115 |
| -0.7994080650317894 | -0.385 |
| -0.06661733875264901 | 0.885 |
| 1.413632832586869e-17 | 0.231 |
| 3.769687553564985e-17 | 0.615 |
| 0.39970403251589487 | 0.308 |
| 0.5995560487738422 | -0.346 |
| 0.13323467750529827 | -0.077 |
| 0.8660254037844387 | -0.5 |
| -0.5995560487738419 | -0.5 |
| -0.2664693550105965 | -0.154 |
| -0.4663213712685438 | -0.269 |
| -0.532938710021193 | 0.077 |
| 4.7121094419562305e-17 | 0.769 |
| 4.7121094419562314e-18 | 0.077 |
| 5.654531330347477e-17 | 0.923 |
| 0.6661733875264914 | -0.154 |
| 0.3330866937632456 | -0.192 |
| 0.3997040325158948 | -0.231 |
| 0.3330866937632457 | -0.5 |
| -0.7327907262791402 | -0.423 |
| 0.0 | 0 |
| -0.7327907262791402 | -0.423 |
| -0.26646935501059643 | 0.538 |
| 2.8272656651737385e-17 | 0.462 |
| 2.3560547209781155e-17 | 0.385 |
| 0.19985201625794746 | 0.654 |
| 0.7994080650317896 | -0.462 |
| 0.06661733875264908 | -0.038 |
| 0.6661733875264914 | -0.385 |
| -0.19985201625794735 | -0.5 |
| -0.4663213712685438 | -0.269 |
| -0.2664693550105965 | -0.154 |
| -0.7327907262791402 | -0.269 |
| 6.1257422745431e-17 | 1 |
| 9.424218883912463e-18 | 0.154 |
| 4.2408984977606075e-17 | 0.692 |
| 0.46632137126854395 | 0.192 |
| 0.5329387100211931 | -0.308 |
| 0.1998520162579474 | -0.115 |
| 0.7327907262791405 | -0.5 |
| -0.7327907262791403 | -0.5 |
| -0.1998520162579473 | -0.115 |
| -0.532938710021193 | -0.308 |
| -0.4663213712685437 | 0.192 |
| 4.2408984977606075e-17 | 0.692 |
| 9.424218883912463e-18 | 0.154 |
| 6.1257422745431e-17 | 1 |
| 0.7327907262791404 | -0.269 |
| 0.26646935501059654 | -0.154 |
| 0.4663213712685439 | -0.269 |
| 0.19985201625794752 | -0.5 |
| -0.6661733875264911 | -0.385 |
| -0.06661733875264912 | -0.038 |
| -0.7994080650317894 | -0.462 |
| -0.19985201625794724 | 0.654 |
| 2.3560547209781152e-17 | 0.385 |
| 2.8272656651737385e-17 | 0.462 |
| 0.2664693550105966 | 0.538 |
| 0.7327907262791404 | -0.423 |
| 0.0 | 0 |
| 0.7327907262791404 | -0.423 |
| -0.3330866937632455 | -0.5 |
| -0.3997040325158947 | -0.231 |
| -0.33308669376324557 | -0.192 |
| -0.6661733875264911 | -0.154 |
| 5.654531330347477e-17 | 0.923 |
| 4.7121094419562276e-18 | 0.077 |
| 4.712109441956231e-17 | 0.769 |
| 0.5329387100211931 | 0.077 |
| 0.4663213712685439 | -0.269 |
| 0.26646935501059654 | -0.154 |
| 0.5995560487738422 | -0.5 |
| -0.8660254037844385 | -0.5 |
| -0.13323467750529824 | -0.077 |
| -0.599556048773842 | -0.346 |
| -0.39970403251589465 | 0.308 |
| 3.769687553564985e-17 | 0.615 |
| 1.4136328325868693e-17 | 0.231 |
| 0.06661733875264919 | 0.885 |
| 0.7994080650317896 | -0.385 |
| 0.19985201625794735 | -0.115 |
| 0.5329387100211931 | -0.308 |
| 0.06661733875264919 | -0.5 |
| -0.599556048773842 | -0.346 |
| -0.13323467750529824 | -0.077 |
| -0.8660254037844385 | -0.5 |
| -0.1332346775052982 | 0.769 |
| 1.8848437767824926e-17 | 0.308 |
| 3.2984766093693615e-17 | 0.538 |
| 0.33308669376324573 | 0.423 |
| 0.6661733875264912 | -0.385 |
| 0.06661733875264914 | -0.038 |
| 0.7994080650317896 | -0.462 |
| -0.4663213712685438 | -0.5 |
| -0.33308669376324557 | -0.192 |
| -0.3997040325158947 | -0.231 |
| -0.599556048773842 | -0.038 |
| 5.183320386151854e-17 | 0.846 |
| 0.0 | 0 |
| 5.183320386151854e-17 | 0.846 |
| 0.5995560487738422 | -0.038 |
| 0.3997040325158948 | -0.231 |
| 0.3330866937632457 | -0.192 |
| 0.4663213712685439 | -0.5 |
| -0.7994080650317894 | -0.462 |
| -0.06661733875264907 | -0.038 |
| -0.6661733875264911 | -0.385 |
| -0.3330866937632455 | 0.423 |
| 3.2984766093693615e-17 | 0.538 |
| 1.8848437767824926e-17 | 0.308 |
| 0.13323467750529833 | 0.769 |
| 0.8660254037844387 | -0.5 |
| 0.13323467750529827 | -0.077 |
| 0.5995560487738422 | -0.346 |
| -0.06661733875264897 | -0.5 |
| -0.532938710021193 | -0.308 |
| -0.19985201625794735 | -0.115 |
| -0.7994080650317894 | -0.385 |
| -0.06661733875264901 | 0.885 |
| 1.413632832586869e-17 | 0.231 |
| 3.769687553564985e-17 | 0.615 |
| 0.39970403251589487 | 0.308 |
| 0.5995560487738422 | -0.346 |
| 0.13323467750529827 | -0.077 |
| 0.8660254037844387 | -0.5 |
| -0.5995560487738419 | -0.5 |
| -0.2664693550105965 | -0.154 |
| -0.4663213712685438 | -0.269 |
| -0.532938710021193 | 0.077 |
| 4.7121094419562305e-17 | 0.769 |
| 4.7121094419562314e-18 | 0.077 |
| 5.654531330347477e-17 | 0.923 |
| 0.6661733875264914 | -0.154 |
| 0.3330866937632456 | -0.192 |
| 0.3997040325158948 | -0.231 |
| 0.3330866937632457 | -0.5 |
| -0.7327907262791402 | -0.423 |
| 0.0 | 0 |
| -0.7327907262791402 | -0.423 |
| -0.26646935501059643 | 0.538 |
| 2.8272656651737385e-17 | 0.462 |
| 2.3560547209781155e-17 | 0.385 |
| 0.19985201625794746 | 0.654 |
| 0.7994080650317896 | -0.462 |
| 0.06661733875264908 | -0.038 |
| 0.6661733875264914 | -0.385 |
| -0.19985201625794735 | -0.5 |
| -0.4663213712685438 | -0.269 |
| -0.2664693550105965 | -0.154 |
| -0.7327907262791402 | -0.269 |
| 6.1257422745431e-17 | 1 |
| 9.424218883912463e-18 | 0.154 |
| 4.2408984977606075e-17 | 0.692 |
| 0.46632137126854395 | 0.192 |
| 0.5329387100211931 | -0.308 |
| 0.1998520162579474 | -0.115 |
| 0.7327907262791405 | -0.5 |
| -0.7327907262791403 | -0.5 |
| -0.1998520162579473 | -0.115 |
| -0.532938710021193 | -0.308 |
| -0.4663213712685437 | 0.192 |
| 4.2408984977606075e-17 | 0.692 |
| 9.424218883912463e-18 | 0.154 |
| 6.1257422745431e-17 | 1 |
| 0.7327907262791404 | -0.269 |
| 0.26646935501059654 | -0.154 |
| 0.4663213712685439 | -0.269 |
| 0.19985201625794752 | -0.5 |
| -0.6661733875264911 | -0.385 |
| -0.06661733875264912 | -0.038 |
| -0.7994080650317894 | -0.462 |
| -0.19985201625794724 | 0.654 |
| 2.3560547209781152e-17 | 0.385 |
| 2.8272656651737385e-17 | 0.462 |
| 0.2664693550105966 | 0.538 |
| 0.7327907262791404 | -0.423 |
| 0.0 | 0 |
| 0.7327907262791404 | -0.423 |
| -0.3330866937632455 | -0.5 |
| -0.3997040325158947 | -0.231 |
| -0.33308669376324557 | -0.192 |
| -0.6661733875264911 | -0.154 |
| 5.654531330347477e-17 | 0.923 |
| 4.7121094419562276e-18 | 0.077 |
| 4.712109441956231e-17 | 0.769 |
| 0.5329387100211931 | 0.077 |
| 0.4663213712685439 | -0.269 |
| 0.26646935501059654 | -0.154 |
| 0.5995560487738422 | -0.5 |
| -0.8660254037844385 | -0.5 |
| -0.13323467750529824 | -0.077 |
| -0.599556048773842 | -0.346 |
| -0.39970403251589465 | 0.308 |
| 3.769687553564985e-17 | 0.615 |
| 1.4136328325868693e-17 | 0.231 |
| 0.06661733875264919 | 0.885 |
| 0.7994080650317896 | -0.385 |
| 0.19985201625794735 | -0.115 |
| 0.5329387100211931 | -0.308 |
| 0.06661733875264919 | -0.5 |
| -0.599556048773842 | -0.346 |
| -0.13323467750529824 | -0.077 |
| -0.8660254037844385 | -0.5 |
| -0.1332346775052982 | 0.769 |
| 1.8848437767824926e-17 | 0.308 |
| 3.2984766093693615e-17 | 0.538 |
| 0.33308669376324573 | 0.423 |
| 0.6661733875264912 | -0.385 |
| 0.06661733875264914 | -0.038 |
| 0.7994080650317896 | -0.462 |
| -0.4663213712685438 | -0.5 |
| -0.33308669376324557 | -0.192 |
| -0.3997040325158947 | -0.231 |
| -0.599556048773842 | -0.038 |
| 5.183320386151854e-17 | 0.846 |
| 0.0 | 0 |
| 5.183320386151854e-17 | 0.846 |
| 0.5995560487738422 | -0.038 |
| 0.3997040325158948 | -0.231 |
| 0.3330866937632457 | -0.192 |
| 0.4663213712685439 | -0.5 |
| -0.7994080650317894 | -0.462 |
| -0.06661733875264907 | -0.038 |
| -0.6661733875264911 | -0.385 |
| -0.3330866937632455 | 0.423 |
| 3.2984766093693615e-17 | 0.538 |
| 1.8848437767824926e-17 | 0.308 |
| 0.13323467750529833 | 0.769 |
| 0.8660254037844387 | -0.5 |
| 0.13323467750529827 | -0.077 |
| 0.5995560487738422 | -0.346 |
| -0.06661733875264897 | -0.5 |
| -0.532938710021193 | -0.308 |
| -0.19985201625794735 | -0.115 |
| -0.7994080650317894 | -0.385 |
| -0.06661733875264901 | 0.885 |
| 1.413632832586869e-17 | 0.231 |
| 3.769687553564985e-17 | 0.615 |
| 0.39970403251589487 | 0.308 |
| 0.5995560487738422 | -0.346 |
| 0.13323467750529827 | -0.077 |
| 0.8660254037844387 | -0.5 |
| -0.5995560487738419 | -0.5 |
| -0.2664693550105965 | -0.154 |
| -0.4663213712685438 | -0.269 |
| -0.532938710021193 | 0.077 |
| 4.7121094419562305e-17 | 0.769 |
| 4.7121094419562314e-18 | 0.077 |
| 5.654531330347477e-17 | 0.923 |
| 0.6661733875264914 | -0.154 |
| 0.3330866937632456 | -0.192 |
| 0.3997040325158948 | -0.231 |
| 0.3330866937632457 | -0.5 |
| -0.7327907262791402 | -0.423 |
| 0.0 | 0 |
| -0.7327907262791402 | -0.423 |
| -0.26646935501059643 | 0.538 |
| 2.8272656651737385e-17 | 0.462 |
| 2.3560547209781155e-17 | 0.385 |
| 0.19985201625794746 | 0.654 |
| 0.7994080650317896 | -0.462 |
| 0.06661733875264908 | -0.038 |
| 0.6661733875264914 | -0.385 |
| -0.19985201625794735 | -0.5 |
| -0.4663213712685438 | -0.269 |
| -0.2664693550105965 | -0.154 |
| -0.7327907262791402 | -0.269 |
| 6.1257422745431e-17 | 1 |
| 9.424218883912463e-18 | 0.154 |
| 4.2408984977606075e-17 | 0.692 |
| 0.46632137126854395 | 0.192 |
| 0.5329387100211931 | -0.308 |
| 0.1998520162579474 | -0.115 |
| 0.7327907262791405 | -0.5 |
| -0.7327907262791403 | -0.5 |
| -0.1998520162579473 | -0.115 |
| -0.532938710021193 | -0.308 |
| -0.4663213712685437 | 0.192 |
| 4.2408984977606075e-17 | 0.692 |
| 9.424218883912463e-18 | 0.154 |
| 6.1257422745431e-17 | 1 |
| 0.7327907262791404 | -0.269 |
| 0.26646935501059654 | -0.154 |
| 0.4663213712685439 | -0.269 |
| 0.19985201625794752 | -0.5 |
| -0.6661733875264911 | -0.385 |
| -0.06661733875264912 | -0.038 |
| -0.7994080650317894 | -0.462 |
| -0.19985201625794724 | 0.654 |
| 2.3560547209781152e-17 | 0.385 |
| 2.8272656651737385e-17 | 0.462 |
| 0.2664693550105966 | 0.538 |
| 0.7327907262791404 | -0.423 |
| 0.0 | 0 |
| 0.7327907262791404 | -0.423 |
| -0.3330866937632455 | -0.5 |
| -0.3997040325158947 | -0.231 |
| -0.33308669376324557 | -0.192 |
| -0.6661733875264911 | -0.154 |
| 5.654531330347477e-17 | 0.923 |
| 4.7121094419562276e-18 | 0.077 |
| 4.712109441956231e-17 | 0.769 |
| 0.5329387100211931 | 0.077 |
| 0.4663213712685439 | -0.269 |
| 0.26646935501059654 | -0.154 |
| 0.5995560487738422 | -0.5 |
| -0.8660254037844385 | -0.5 |
| -0.13323467750529824 | -0.077 |
| -0.599556048773842 | -0.346 |
| -0.39970403251589465 | 0.308 |
| 3.769687553564985e-17 | 0.615 |
| 1.4136328325868693e-17 | 0.231 |
| 0.06661733875264919 | 0.885 |
| 0.7994080650317896 | -0.385 |
| 0.19985201625794735 | -0.115 |
| 0.5329387100211931 | -0.308 |
| 0.06661733875264919 | -0.5 |
| -0.599556048773842 | -0.346 |
| -0.13323467750529824 | -0.077 |
| -0.8660254037844385 | -0.5 |
| -0.1332346775052982 | 0.769 |
| 1.8848437767824926e-17 | 0.308 |
| 3.2984766093693615e-17 | 0.538 |
| 0.33308669376324573 | 0.423 |
| 0.6661733875264912 | -0.385 |
| 0.06661733875264914 | -0.038 |
| 0.7994080650317896 | -0.462 |
| -0.4663213712685438 | -0.5 |
| -0.33308669376324557 | -0.192 |
| -0.3997040325158947 | -0.231 |
| -0.599556048773842 | -0.038 |
| 5.183320386151854e-17 | 0.846 |
| 0.0 | 0 |
| 5.183320386151854e-17 | 0.846 |
| 0.5995560487738422 | -0.038 |
| 0.3997040325158948 | -0.231 |
| 0.3330866937632457 | -0.192 |
| 0.4663213712685439 | -0.5 |
| -0.7994080650317894 | -0.462 |
| -0.06661733875264907 | -0.038 |
| -0.6661733875264911 | -0.385 |
| -0.3330866937632455 | 0.423 |
| 3.2984766093693615e-17 | 0.538 |
| 1.8848437767824926e-17 | 0.308 |
| 0.13323467750529833 | 0.769 |
| 0.8660254037844387 | -0.5 |
| 0.13323467750529827 | -0.077 |
| 0.5995560487738422 | -0.346 |
| -0.06661733875264897 | -0.5 |
| -0.532938710021193 | -0.308 |
| -0.19985201625794735 | -0.115 |
| -0.7994080650317894 | -0.385 |
| -0.06661733875264901 | 0.885 |
| 1.413632832586869e-17 | 0.231 |
| 3.769687553564985e-17 | 0.615 |
| 0.39970403251589487 | 0.308 |
| 0.5995560487738422 | -0.346 |
| 0.13323467750529827 | -0.077 |
| 0.8660254037844387 | -0.5 |
| -0.5995560487738419 | -0.5 |
| -0.2664693550105965 | -0.154 |
| -0.4663213712685438 | -0.269 |
| -0.532938710021193 | 0.077 |
| 4.7121094419562305e-17 | 0.769 |
| 4.7121094419562314e-18 | 0.077 |
| 5.654531330347477e-17 | 0.923 |
| 0.6661733875264914 | -0.154 |
| 0.3330866937632456 | -0.192 |
| 0.3997040325158948 | -0.231 |
| 0.3330866937632457 | -0.5 |
| -0.7327907262791402 | -0.423 |
| 0.0 | 0 |
| -0.7327907262791402 | -0.423 |
| -0.26646935501059643 | 0.538 |
| 2.8272656651737385e-17 | 0.462 |
| 2.3560547209781155e-17 | 0.385 |
| 0.19985201625794746 | 0.654 |
| 0.7994080650317896 | -0.462 |
| 0.06661733875264908 | -0.038 |
| 0.6661733875264914 | -0.385 |
| -0.19985201625794735 | -0.5 |
| -0.4663213712685438 | -0.269 |
| -0.2664693550105965 | -0.154 |
| -0.7327907262791402 | -0.269 |
| 6.1257422745431e-17 | 1 |
| 9.424218883912463e-18 | 0.154 |
| 4.2408984977606075e-17 | 0.692 |
| 0.46632137126854395 | 0.192 |
| 0.5329387100211931 | -0.308 |
| 0.1998520162579474 | -0.115 |
| 0.7327907262791405 | -0.5 |
| -0.7327907262791403 | -0.5 |
| -0.1998520162579473 | -0.115 |
| -0.532938710021193 | -0.308 |
| -0.4663213712685437 | 0.192 |
| 4.2408984977606075e-17 | 0.692 |
| 9.424218883912463e-18 | 0.154 |
| 6.1257422745431e-17 | 1 |
| 0.7327907262791404 | -0.269 |
| 0.26646935501059654 | -0.154 |
| 0.4663213712685439 | -0.269 |
| 0.19985201625794752 | -0.5 |
| -0.6661733875264911 | -0.385 |
| -0.06661733875264912 | -0.038 |
| -0.7994080650317894 | -0.462 |
| -0.19985201625794724 | 0.654 |
| 2.3560547209781152e-17 | 0.385 |
| 2.8272656651737385e-17 | 0.462 |
| 0.2664693550105966 | 0.538 |
| 0.7327907262791404 | -0.423 |
| 0.0 | 0 |
| 0.7327907262791404 | -0.423 |
| -0.3330866937632455 | -0.5 |
| -0.3997040325158947 | -0.231 |
| -0.33308669376324557 | -0.192 |
| -0.6661733875264911 | -0.154 |
| 5.654531330347477e-17 | 0.923 |
| 4.7121094419562276e-18 | 0.077 |
| 4.712109441956231e-17 | 0.769 |
| 0.5329387100211931 | 0.077 |
| 0.4663213712685439 | -0.269 |
| 0.26646935501059654 | -0.154 |
| 0.5995560487738422 | -0.5 |
| -0.8660254037844385 | -0.5 |
| -0.13323467750529824 | -0.077 |
| -0.599556048773842 | -0.346 |
| -0.39970403251589465 | 0.308 |
| 3.769687553564985e-17 | 0.615 |
| 1.4136328325868693e-17 | 0.231 |
| 0.06661733875264919 | 0.885 |
| 0.7994080650317896 | -0.385 |
| 0.19985201625794735 | -0.115 |
| 0.5329387100211931 | -0.308 |
| 0.06661733875264919 | -0.5 |
| -0.599556048773842 | -0.346 |
| -0.13323467750529824 | -0.077 |
| -0.8660254037844385 | -0.5 |
| -0.1332346775052982 | 0.769 |
| 1.8848437767824926e-17 | 0.308 |
| 3.2984766093693615e-17 | 0.538 |
| 0.33308669376324573 | 0.423 |
| 0.6661733875264912 | -0.385 |
| 0.06661733875264914 | -0.038 |
| 0.7994080650317896 | -0.462 |
| -0.4663213712685438 | -0.5 |
| -0.33308669376324557 | -0.192 |
| -0.3997040325158947 | -0.231 |
| -0.599556048773842 | -0.038 |
| 5.183320386151854e-17 | 0.846 |
| 0.0 | 0 |
| 5.183320386151854e-17 | 0.846 |
| 0.5995560487738422 | -0.038 |
| 0.3997040325158948 | -0.231 |
| 0.3330866937632457 | -0.192 |
| 0.4663213712685439 | -0.5 |
| -0.7994080650317894 | -0.462 |
| -0.06661733875264907 | -0.038 |
| -0.6661733875264911 | -0.385 |
| -0.3330866937632455 | 0.423 |
| 3.2984766093693615e-17 | 0.538 |
| 1.8848437767824926e-17 | 0.308 |
| 0.13323467750529833 | 0.769 |
| 0.8660254037844387 | -0.5 |
| 0.13323467750529827 | -0.077 |
| 0.5995560487738422 | -0.346 |
| -0.06661733875264897 | -0.5 |
| -0.532938710021193 | -0.308 |
| -0.19985201625794735 | -0.115 |
| -0.7994080650317894 | -0.385 |
| -0.06661733875264901 | 0.885 |
| 1.413632832586869e-17 | 0.231 |
| 3.769687553564985e-17 | 0.615 |
| 0.39970403251589487 | 0.308 |
| 0.5995560487738422 | -0.346 |
| 0.13323467750529827 | -0.077 |
| 0.8660254037844387 | -0.5 |
| -0.5995560487738419 | -0.5 |
| -0.2664693550105965 | -0.154 |
| -0.4663213712685438 | -0.269 |
| -0.532938710021193 | 0.077 |
| 4.7121094419562305e-17 | 0.769 |
| 4.7121094419562314e-18 | 0.077 |
| 5.654531330347477e-17 | 0.923 |
| 0.6661733875264914 | -0.154 |
| 0.3330866937632456 | -0.192 |
| 0.3997040325158948 | -0.231 |
| 0.3330866937632457 | -0.5 |
| -0.7327907262791402 | -0.423 |
| 0.0 | 0 |
| -0.7327907262791402 | -0.423 |
| -0.26646935501059643 | 0.538 |
| 2.8272656651737385e-17 | 0.462 |
| 2.3560547209781155e-17 | 0.385 |
| 0.19985201625794746 | 0.654 |
| 0.7994080650317896 | -0.462 |
| 0.06661733875264908 | -0.038 |
| 0.6661733875264914 | -0.385 |
| -0.19985201625794735 | -0.5 |
| -0.4663213712685438 | -0.269 |
| -0.2664693550105965 | -0.154 |
| -0.7327907262791402 | -0.269 |
| 6.1257422745431e-17 | 1 |
| 9.424218883912463e-18 | 0.154 |
| 4.2408984977606075e-17 | 0.692 |
| 0.46632137126854395 | 0.192 |
| 0.5329387100211931 | -0.308 |
| 0.1998520162579474 | -0.115 |
| 0.7327907262791405 | -0.5 |
| -0.7327907262791403 | -0.5 |
| -0.1998520162579473 | -0.115 |
| -0.532938710021193 | -0.308 |
| -0.4663213712685437 | 0.192 |
| 4.2408984977606075e-17 | 0.692 |
| 9.424218883912463e-18 | 0.154 |
| 6.1257422745431e-17 | 1 |
| 0.7327907262791404 | -0.269 |
| 0.26646935501059654 | -0.154 |
| 0.4663213712685439 | -0.269 |
| 0.19985201625794752 | -0.5 |
| -0.6661733875264911 | -0.385 |
| -0.06661733875264912 | -0.038 |
| -0.7994080650317894 | -0.462 |
| -0.19985201625794724 | 0.654 |
| 2.3560547209781152e-17 | 0.385 |
| 2.8272656651737385e-17 | 0.462 |
| 0.2664693550105966 | 0.538 |
| 0.7327907262791404 | -0.423 |
| 0.0 | 0 |
| 0.7327907262791404 | -0.423 |
| -0.3330866937632455 | -0.5 |
| -0.3997040325158947 | -0.231 |
| -0.33308669376324557 | -0.192 |
| -0.6661733875264911 | -0.154 |
| 5.654531330347477e-17 | 0.923 |
| 4.7121094419562276e-18 | 0.077 |
| 4.712109441956231e-17 | 0.769 |
| 0.5329387100211931 | 0.077 |
| 0.4663213712685439 | -0.269 |
| 0.26646935501059654 | -0.154 |
| 0.5995560487738422 | -0.5 |
| -0.8660254037844385 | -0.5 |
| -0.13323467750529824 | -0.077 |
| -0.599556048773842 | -0.346 |
| -0.39970403251589465 | 0.308 |
| 3.769687553564985e-17 | 0.615 |
| 1.4136328325868693e-17 | 0.231 |
| 0.06661733875264919 | 0.885 |
| 0.7994080650317896 | -0.385 |
| 0.19985201625794735 | -0.115 |
| 0.5329387100211931 | -0.308 |
| 0.06661733875264919 | -0.5 |
| -0.599556048773842 | -0.346 |
| -0.13323467750529824 | -0.077 |
| -0.8660254037844385 | -0.5 |
| -0.1332346775052982 | 0.769 |
| 1.8848437767824926e-17 | 0.308 |
| 3.2984766093693615e-17 | 0.538 |
| 0.33308669376324573 | 0.423 |
| 0.6661733875264912 | -0.385 |
| 0.06661733875264914 | -0.038 |
| 0.7994080650317896 | -0.462 |
| -0.4663213712685438 | -0.5 |
| -0.33308669376324557 | -0.192 |
| -0.3997040325158947 | -0.231 |
| -0.599556048773842 | -0.038 |
| 5.183320386151854e-17 | 0.846 |
| 0.0 | 0 |
| 5.183320386151854e-17 | 0.846 |
| 0.5995560487738422 | -0.038 |
| 0.3997040325158948 | -0.231 |
| 0.3330866937632457 | -0.192 |
| 0.4663213712685439 | -0.5 |
| -0.7994080650317894 | -0.462 |
| -0.06661733875264907 | -0.038 |
| -0.6661733875264911 | -0.385 |
| -0.3330866937632455 | 0.423 |
| 3.2984766093693615e-17 | 0.538 |
| 1.8848437767824926e-17 | 0.308 |
| 0.13323467750529833 | 0.769 |
| 0.8660254037844387 | -0.5 |
| 0.13323467750529827 | -0.077 |
| 0.5995560487738422 | -0.346 |
| -0.06661733875264897 | -0.5 |
| -0.532938710021193 | -0.308 |
| -0.19985201625794735 | -0.115 |
| -0.7994080650317894 | -0.385 |
| -0.06661733875264901 | 0.885 |
| 1.413632832586869e-17 | 0.231 |
| 3.769687553564985e-17 | 0.615 |
| 0.39970403251589487 | 0.308 |
| 0.5995560487738422 | -0.346 |
| 0.13323467750529827 | -0.077 |
| 0.8660254037844387 | -0.5 |
| -0.5995560487738419 | -0.5 |
| -0.2664693550105965 | -0.154 |
| -0.4663213712685438 | -0.269 |
| -0.532938710021193 | 0.077 |
| 4.7121094419562305e-17 | 0.769 |
| 4.7121094419562314e-18 | 0.077 |
| 5.654531330347477e-17 | 0.923 |
| 0.6661733875264914 | -0.154 |
| 0.3330866937632456 | -0.192 |
| 0.3997040325158948 | -0.231 |
| 0.3330866937632457 | -0.5 |
| -0.7327907262791402 | -0.423 |
| 0.0 | 0 |
| -0.7327907262791402 | -0.423 |
| -0.26646935501059643 | 0.538 |
| 2.8272656651737385e-17 | 0.462 |
| 2.3560547209781155e-17 | 0.385 |
| 0.19985201625794746 | 0.654 |
| 0.7994080650317896 | -0.462 |
| 0.06661733875264908 | -0.038 |
| 0.6661733875264914 | -0.385 |
| -0.19985201625794735 | -0.5 |
| -0.4663213712685438 | -0.269 |
| -0.2664693550105965 | -0.154 |
| -0.7327907262791402 | -0.269 |
| 6.1257422745431e-17 | 1 |
| 9.424218883912463e-18 | 0.154 |
| 4.2408984977606075e-17 | 0.692 |
| 0.46632137126854395 | 0.192 |
| 0.5329387100211931 | -0.308 |
| 0.1998520162579474 | -0.115 |
| 0.7327907262791405 | -0.5 |
| -0.7327907262791403 | -0.5 |
| -0.1998520162579473 | -0.115 |
| -0.532938710021193 | -0.308 |
| -0.4663213712685437 | 0.192 |
| 4.2408984977606075e-17 | 0.692 |
| 9.424218883912463e-18 | 0.154 |
| 6.1257422745431e-17 | 1 |
| 0.7327907262791404 | -0.269 |
| 0.26646935501059654 | -0.154 |
| 0.4663213712685439 | -0.269 |
| 0.19985201625794752 | -0.5 |
| -0.6661733875264911 | -0.385 |
| -0.06661733875264912 | -0.038 |
| -0.7994080650317894 | -0.462 |
| -0.19985201625794724 | 0.654 |
| 2.3560547209781152e-17 | 0.385 |
| 2.8272656651737385e-17 | 0.462 |
| 0.2664693550105966 | 0.538 |
| 0.7327907262791404 | -0.423 |
| 0.0 | 0 |
| 0.7327907262791404 | -0.423 |
| -0.3330866937632455 | -0.5 |
| -0.3997040325158947 | -0.231 |
| -0.33308669376324557 | -0.192 |
| -0.6661733875264911 | -0.154 |
| 5.654531330347477e-17 | 0.923 |
| 4.7121094419562276e-18 | 0.077 |
| 4.712109441956231e-17 | 0.769 |
| 0.5329387100211931 | 0.077 |
| 0.4663213712685439 | -0.269 |
| 0.26646935501059654 | -0.154 |
| 0.5995560487738422 | -0.5 |
| -0.8660254037844385 | -0.5 |
| -0.13323467750529824 | -0.077 |
| -0.599556048773842 | -0.346 |
| -0.39970403251589465 | 0.308 |
| 3.769687553564985e-17 | 0.615 |
| 1.4136328325868693e-17 | 0.231 |
| 0.06661733875264919 | 0.885 |
| 0.7994080650317896 | -0.385 |
| 0.19985201625794735 | -0.115 |
| 0.5329387100211931 | -0.308 |
| 0.06661733875264919 | -0.5 |
| -0.599556048773842 | -0.346 |
| -0.13323467750529824 | -0.077 |
| -0.8660254037844385 | -0.5 |
| -0.1332346775052982 | 0.769 |
| 1.8848437767824926e-17 | 0.308 |
| 3.2984766093693615e-17 | 0.538 |
| 0.33308669376324573 | 0.423 |
| 0.6661733875264912 | -0.385 |
| 0.06661733875264914 | -0.038 |
| 0.7994080650317896 | -0.462 |
| -0.4663213712685438 | -0.5 |
| -0.33308669376324557 | -0.192 |
| -0.3997040325158947 | -0.231 |
| -0.599556048773842 | -0.038 |
| 5.183320386151854e-17 | 0.846 |
| 0.0 | 0 |
| 5.183320386151854e-17 | 0.846 |
| 0.5995560487738422 | -0.038 |
| 0.3997040325158948 | -0.231 |
| 0.3330866937632457 | -0.192 |
| 0.4663213712685439 | -0.5 |
| -0.7994080650317894 | -0.462 |
| -0.06661733875264907 | -0.038 |
| -0.6661733875264911 | -0.385 |
| -0.3330866937632455 | 0.423 |
| 3.2984766093693615e-17 | 0.538 |
| 1.8848437767824926e-17 | 0.308 |
| 0.13323467750529833 | 0.769 |
| 0.8660254037844387 | -0.5 |
| 0.13323467750529827 | -0.077 |
| 0.5995560487738422 | -0.346 |
| -0.06661733875264897 | -0.5 |
| -0.532938710021193 | -0.308 |
| -0.19985201625794735 | -0.115 |
| -0.7994080650317894 | -0.385 |
| -0.06661733875264901 | 0.885 |
| 1.413632832586869e-17 | 0.231 |
| 3.769687553564985e-17 | 0.615 |
| 0.39970403251589487 | 0.308 |
| 0.5995560487738422 | -0.346 |
| 0.13323467750529827 | -0.077 |
| 0.8660254037844387 | -0.5 |
| -0.5995560487738419 | -0.5 |
| -0.2664693550105965 | -0.154 |
| -0.4663213712685438 | -0.269 |
| -0.532938710021193 | 0.077 |
| 4.7121094419562305e-17 | 0.769 |
| 4.7121094419562314e-18 | 0.077 |
| 5.654531330347477e-17 | 0.923 |
| 0.6661733875264914 | -0.154 |
| 0.3330866937632456 | -0.192 |
| 0.3997040325158948 | -0.231 |
| 0.3330866937632457 | -0.5 |
| -0.7327907262791402 | -0.423 |
| 0.0 | 0 |
| -0.7327907262791402 | -0.423 |
| -0.26646935501059643 | 0.538 |
| 2.8272656651737385e-17 | 0.462 |
| 2.3560547209781155e-17 | 0.385 |
| 0.19985201625794746 | 0.654 |
| 0.7994080650317896 | -0.462 |
| 0.06661733875264908 | -0.038 |
| 0.6661733875264914 | -0.385 |
| -0.19985201625794735 | -0.5 |
| -0.4663213712685438 | -0.269 |
| -0.2664693550105965 | -0.154 |
| -0.7327907262791402 | -0.269 |
| 6.1257422745431e-17 | 1 |
| 9.424218883912463e-18 | 0.154 |
| 4.2408984977606075e-17 | 0.692 |
| 0.46632137126854395 | 0.192 |
| 0.5329387100211931 | -0.308 |
| 0.1998520162579474 | -0.115 |
| 0.7327907262791405 | -0.5 |
| -0.7327907262791403 | -0.5 |
| -0.1998520162579473 | -0.115 |
| -0.532938710021193 | -0.308 |
| -0.4663213712685437 | 0.192 |
| 4.2408984977606075e-17 | 0.692 |
| 9.424218883912463e-18 | 0.154 |
| 6.1257422745431e-17 | 1 |
| 0.7327907262791404 | -0.269 |
| 0.26646935501059654 | -0.154 |
| 0.4663213712685439 | -0.269 |
| 0.19985201625794752 | -0.5 |
| -0.6661733875264911 | -0.385 |
| -0.06661733875264912 | -0.038 |
| -0.7994080650317894 | -0.462 |
| -0.19985201625794724 | 0.654 |
| 2.3560547209781152e-17 | 0.385 |
| 2.8272656651737385e-17 | 0.462 |
| 0.2664693550105966 | 0.538 |
| 0.7327907262791404 | -0.423 |
| 0.0 | 0 |
| 0.7327907262791404 | -0.423 |
| -0.3330866937632455 | -0.5 |
| -0.3997040325158947 | -0.231 |
| -0.33308669376324557 | -0.192 |
| -0.6661733875264911 | -0.154 |
| 5.654531330347477e-17 | 0.923 |
| 4.7121094419562276e-18 | 0.077 |
| 4.712109441956231e-17 | 0.769 |
| 0.5329387100211931 | 0.077 |
| 0.4663213712685439 | -0.269 |
| 0.26646935501059654 | -0.154 |
| 0.5995560487738422 | -0.5 |
| -0.8660254037844385 | -0.5 |
| -0.13323467750529824 | -0.077 |
| -0.599556048773842 | -0.346 |
| -0.39970403251589465 | 0.308 |
| 3.769687553564985e-17 | 0.615 |
| 1.4136328325868693e-17 | 0.231 |
| 0.06661733875264919 | 0.885 |
| 0.7994080650317896 | -0.385 |
| 0.19985201625794735 | -0.115 |
| 0.5329387100211931 | -0.308 |
| 0.06661733875264919 | -0.5 |
| -0.599556048773842 | -0.346 |
| -0.13323467750529824 | -0.077 |
| -0.8660254037844385 | -0.5 |
| -0.1332346775052982 | 0.769 |
| 1.8848437767824926e-17 | 0.308 |
| 3.2984766093693615e-17 | 0.538 |
| 0.33308669376324573 | 0.423 |
| 0.6661733875264912 | -0.385 |
| 0.06661733875264914 | -0.038 |
| 0.7994080650317896 | -0.462 |
| -0.4663213712685438 | -0.5 |
| -0.33308669376324557 | -0.192 |
| -0.3997040325158947 | -0.231 |
| -0.599556048773842 | -0.038 |
| 5.183320386151854e-17 | 0.846 |
| 0.0 | 0 |
| 5.183320386151854e-17 | 0.846 |
| 0.5995560487738422 | -0.038 |
| 0.3997040325158948 | -0.231 |
| 0.3330866937632457 | -0.192 |
| 0.4663213712685439 | -0.5 |
| -0.7994080650317894 | -0.462 |
| -0.06661733875264907 | -0.038 |
| -0.6661733875264911 | -0.385 |
| -0.3330866937632455 | 0.423 |
| 3.2984766093693615e-17 | 0.538 |
| 1.8848437767824926e-17 | 0.308 |
| 0.13323467750529833 | 0.769 |
| 0.8660254037844387 | -0.5 |
| 0.13323467750529827 | -0.077 |
| 0.5995560487738422 | -0.346 |
| -0.06661733875264897 | -0.5 |
| -0.532938710021193 | -0.308 |
| -0.19985201625794735 | -0.115 |
| -0.7994080650317894 | -0.385 |
| -0.06661733875264901 | 0.885 |
| 1.413632832586869e-17 | 0.231 |
| 3.769687553564985e-17 | 0.615 |
| 0.39970403251589487 | 0.308 |
| 0.5995560487738422 | -0.346 |
| 0.13323467750529827 | -0.077 |
| 0.8660254037844387 | -0.5 |
| -0.5995560487738419 | -0.5 |
| -0.2664693550105965 | -0.154 |
| -0.4663213712685438 | -0.269 |
| -0.532938710021193 | 0.077 |
| 4.7121094419562305e-17 | 0.769 |
| 4.7121094419562314e-18 | 0.077 |
| 5.654531330347477e-17 | 0.923 |
| 0.6661733875264914 | -0.154 |
| 0.3330866937632456 | -0.192 |
| 0.3997040325158948 | -0.231 |
| 0.3330866937632457 | -0.5 |
| -0.7327907262791402 | -0.423 |
| 0.0 | 0 |
| -0.7327907262791402 | -0.423 |
| -0.26646935501059643 | 0.538 |
| 2.8272656651737385e-17 | 0.462 |
| 2.3560547209781155e-17 | 0.385 |
| 0.19985201625794746 | 0.654 |
| 0.7994080650317896 | -0.462 |
| 0.06661733875264908 | -0.038 |
| 0.6661733875264914 | -0.385 |
| -0.19985201625794735 | -0.5 |
| -0.4663213712685438 | -0.269 |
| -0.2664693550105965 | -0.154 |
| -0.7327907262791402 | -0.269 |
| 6.1257422745431e-17 | 1 |
| 9.424218883912463e-18 | 0.154 |
| 4.2408984977606075e-17 | 0.692 |
| 0.46632137126854395 | 0.192 |
| 0.5329387100211931 | -0.308 |
| 0.1998520162579474 | -0.115 |
| 0.7327907262791405 | -0.5 |
| -0.7327907262791403 | -0.5 |
| -0.1998520162579473 | -0.115 |
| -0.532938710021193 | -0.308 |
| -0.4663213712685437 | 0.192 |
| 4.2408984977606075e-17 | 0.692 |
| 9.424218883912463e-18 | 0.154 |
| 6.1257422745431e-17 | 1 |
| 0.7327907262791404 | -0.269 |
| 0.26646935501059654 | -0.154 |
| 0.4663213712685439 | -0.269 |
| 0.19985201625794752 | -0.5 |
| -0.6661733875264911 | -0.385 |
| -0.06661733875264912 | -0.038 |
| -0.7994080650317894 | -0.462 |
| -0.19985201625794724 | 0.654 |
| 2.3560547209781152e-17 | 0.385 |
| 2.8272656651737385e-17 | 0.462 |
| 0.2664693550105966 | 0.538 |
| 0.7327907262791404 | -0.423 |
| 0.0 | 0 |
| 0.7327907262791404 | -0.423 |
| -0.3330866937632455 | -0.5 |
| -0.3997040325158947 | -0.231 |
| -0.33308669376324557 | -0.192 |
| -0.6661733875264911 | -0.154 |
| 5.654531330347477e-17 | 0.923 |
| 4.7121094419562276e-18 | 0.077 |
| 4.712109441956231e-17 | 0.769 |
| 0.5329387100211931 | 0.077 |
| 0.4663213712685439 | -0.269 |
| 0.26646935501059654 | -0.154 |
| 0.5995560487738422 | -0.5 |
| -0.8660254037844385 | -0.5 |
| -0.13323467750529824 | -0.077 |
| -0.599556048773842 | -0.346 |
| -0.39970403251589465 | 0.308 |
| 3.769687553564985e-17 | 0.615 |
| 1.4136328325868693e-17 | 0.231 |
| 0.06661733875264919 | 0.885 |
| 0.7994080650317896 | -0.385 |
| 0.19985201625794735 | -0.115 |
| 0.5329387100211931 | -0.308 |
| 0.06661733875264919 | -0.5 |
| -0.599556048773842 | -0.346 |
| -0.13323467750529824 | -0.077 |
| -0.8660254037844385 | -0.5 |
| -0.1332346775052982 | 0.769 |
| 1.8848437767824926e-17 | 0.308 |
| 3.2984766093693615e-17 | 0.538 |
| 0.33308669376324573 | 0.423 |
| 0.6661733875264912 | -0.385 |
| 0.06661733875264914 | -0.038 |
| 0.7994080650317896 | -0.462 |
| -0.4663213712685438 | -0.5 |
| -0.33308669376324557 | -0.192 |
| -0.3997040325158947 | -0.231 |
| -0.599556048773842 | -0.038 |
| 5.183320386151854e-17 | 0.846 |
| 0.0 | 0 |
| 5.183320386151854e-17 | 0.846 |
| 0.5995560487738422 | -0.038 |
| 0.3997040325158948 | -0.231 |
| 0.3330866937632457 | -0.192 |
| 0.4663213712685439 | -0.5 |
| -0.7994080650317894 | -0.462 |
| -0.06661733875264907 | -0.038 |
| -0.6661733875264911 | -0.385 |
| -0.3330866937632455 | 0.423 |
| 3.2984766093693615e-17 | 0.538 |
| 1.8848437767824926e-17 | 0.308 |
| 0.13323467750529833 | 0.769 |
| 0.8660254037844387 | -0.5 |
| 0.13323467750529827 | -0.077 |
| 0.5995560487738422 | -0.346 |
| -0.06661733875264897 | -0.5 |
| -0.532938710021193 | -0.308 |
| -0.19985201625794735 | -0.115 |
| -0.7994080650317894 | -0.385 |
| -0.06661733875264901 | 0.885 |
| 1.413632832586869e-17 | 0.231 |
| 3.769687553564985e-17 | 0.615 |
| 0.39970403251589487 | 0.308 |
| 0.5995560487738422 | -0.346 |
| 0.13323467750529827 | -0.077 |
| 0.8660254037844387 | -0.5 |
| -0.5995560487738419 | -0.5 |
| -0.2664693550105965 | -0.154 |
| -0.4663213712685438 | -0.269 |
| -0.532938710021193 | 0.077 |
| 4.7121094419562305e-17 | 0.769 |
| 4.7121094419562314e-18 | 0.077 |
| 5.654531330347477e-17 | 0.923 |
| 0.6661733875264914 | -0.154 |
| 0.3330866937632456 | -0.192 |
| 0.3997040325158948 | -0.231 |
| 0.3330866937632457 | -0.5 |
| -0.7327907262791402 | -0.423 |
| 0.0 | 0 |
| -0.7327907262791402 | -0.423 |
| -0.26646935501059643 | 0.538 |
| 2.8272656651737385e-17 | 0.462 |
| 2.3560547209781155e-17 | 0.385 |
| 0.19985201625794746 | 0.654 |
| 0.7994080650317896 | -0.462 |
| 0.06661733875264908 | -0.038 |
| 0.6661733875264914 | -0.385 |
| -0.19985201625794735 | -0.5 |
| -0.4663213712685438 | -0.269 |
| -0.2664693550105965 | -0.154 |
| -0.7327907262791402 | -0.269 |
| 6.1257422745431e-17 | 1 |
| 9.424218883912463e-18 | 0.154 |
| 4.2408984977606075e-17 | 0.692 |
| 0.46632137126854395 | 0.192 |
| 0.5329387100211931 | -0.308 |
| 0.1998520162579474 | -0.115 |
| 0.7327907262791405 | -0.5 |
| -0.7327907262791403 | -0.5 |
| -0.1998520162579473 | -0.115 |
| -0.532938710021193 | -0.308 |
| -0.4663213712685437 | 0.192 |
| 4.2408984977606075e-17 | 0.692 |
| 9.424218883912463e-18 | 0.154 |
| 6.1257422745431e-17 | 1 |
| 0.7327907262791404 | -0.269 |
| 0.26646935501059654 | -0.154 |
| 0.4663213712685439 | -0.269 |
| 0.19985201625794752 | -0.5 |
| -0.6661733875264911 | -0.385 |
| -0.06661733875264912 | -0.038 |
| -0.7994080650317894 | -0.462 |
| -0.19985201625794724 | 0.654 |
| 2.3560547209781152e-17 | 0.385 |
| 2.8272656651737385e-17 | 0.462 |
| 0.2664693550105966 | 0.538 |
| 0.7327907262791404 | -0.423 |
| 0.0 | 0 |
| 0.7327907262791404 | -0.423 |
| -0.3330866937632455 | -0.5 |
| -0.3997040325158947 | -0.231 |
| -0.33308669376324557 | -0.192 |
| -0.6661733875264911 | -0.154 |
| 5.654531330347477e-17 | 0.923 |
| 4.7121094419562276e-18 | 0.077 |
| 4.712109441956231e-17 | 0.769 |
| 0.5329387100211931 | 0.077 |
| 0.4663213712685439 | -0.269 |
| 0.26646935501059654 | -0.154 |
| 0.5995560487738422 | -0.5 |